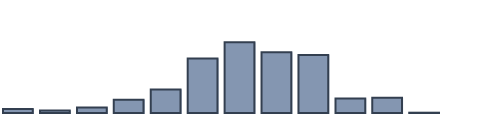
| Category | Series 0 |
|---|---|
| 0 | 1.251 |
| 1 | 0.76 |
| 2 | 1.715 |
| 3 | 4.135 |
| 4 | 7.305 |
| 5 | 16.875 |
| 6 | 21.933 |
| 7 | 18.783 |
| 8 | 17.955 |
| 9 | 4.466 |
| 10 | 4.729 |
| 11 | 0.094 |
| 12 | 0 |